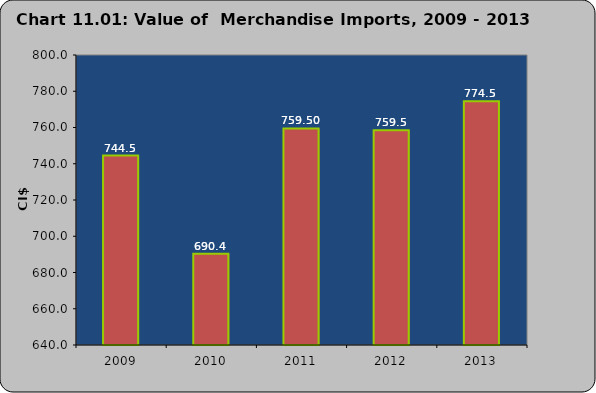
| Category | Series 0 |
|---|---|
| 2009 | 744.538 |
| 2010 | 690.388 |
| 2011 | 759.5 |
| 2012 | 758.5 |
| 2013 | 774.5 |